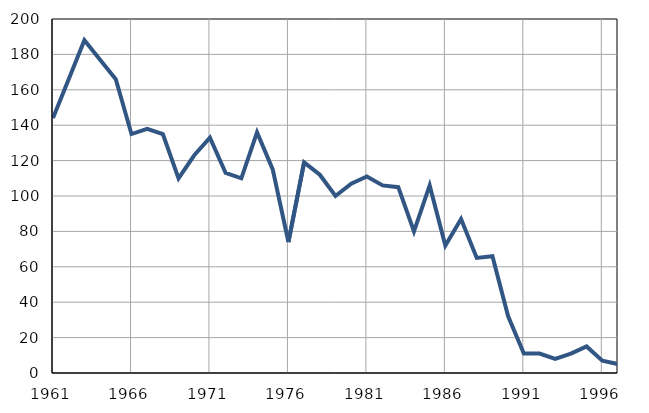
| Category | Infants
deaths |
|---|---|
| 1961.0 | 144 |
| 1962.0 | 166 |
| 1963.0 | 188 |
| 1964.0 | 177 |
| 1965.0 | 166 |
| 1966.0 | 135 |
| 1967.0 | 138 |
| 1968.0 | 135 |
| 1969.0 | 110 |
| 1970.0 | 123 |
| 1971.0 | 133 |
| 1972.0 | 113 |
| 1973.0 | 110 |
| 1974.0 | 136 |
| 1975.0 | 115 |
| 1976.0 | 74 |
| 1977.0 | 119 |
| 1978.0 | 112 |
| 1979.0 | 100 |
| 1980.0 | 107 |
| 1981.0 | 111 |
| 1982.0 | 106 |
| 1983.0 | 105 |
| 1984.0 | 80 |
| 1985.0 | 106 |
| 1986.0 | 72 |
| 1987.0 | 87 |
| 1988.0 | 65 |
| 1989.0 | 66 |
| 1990.0 | 32 |
| 1991.0 | 11 |
| 1992.0 | 11 |
| 1993.0 | 8 |
| 1994.0 | 11 |
| 1995.0 | 15 |
| 1996.0 | 7 |
| 1997.0 | 5 |